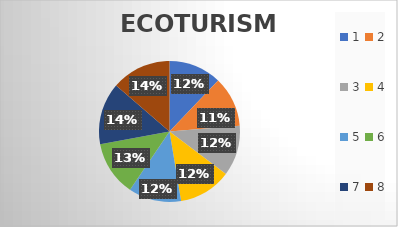
| Category | ECOTURISMO |
|---|---|
| 0 | 23 |
| 1 | 22 |
| 2 | 22 |
| 3 | 23 |
| 4 | 23 |
| 5 | 24 |
| 6 | 27 |
| 7 | 26 |